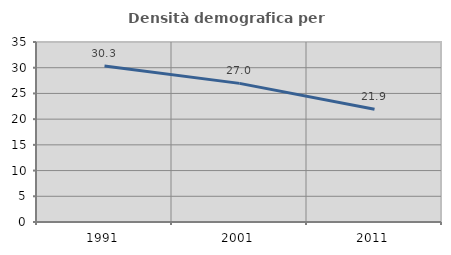
| Category | Densità demografica |
|---|---|
| 1991.0 | 30.32 |
| 2001.0 | 26.956 |
| 2011.0 | 21.91 |